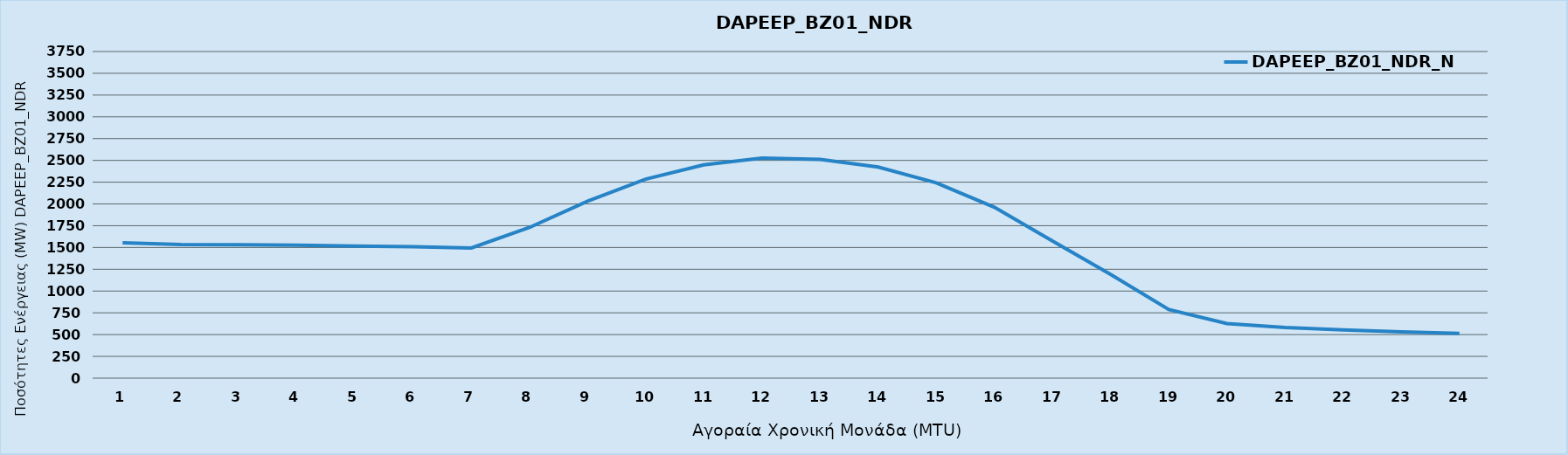
| Category | DAPEEP_BZ01_NDR_N1 |
|---|---|
| 0 | 1555 |
| 1 | 1535 |
| 2 | 1531 |
| 3 | 1527 |
| 4 | 1517 |
| 5 | 1510 |
| 6 | 1494 |
| 7 | 1730 |
| 8 | 2032 |
| 9 | 2285 |
| 10 | 2449 |
| 11 | 2526 |
| 12 | 2511 |
| 13 | 2423 |
| 14 | 2243 |
| 15 | 1962 |
| 16 | 1575 |
| 17 | 1190 |
| 18 | 788 |
| 19 | 627 |
| 20 | 581 |
| 21 | 555 |
| 22 | 532 |
| 23 | 514 |